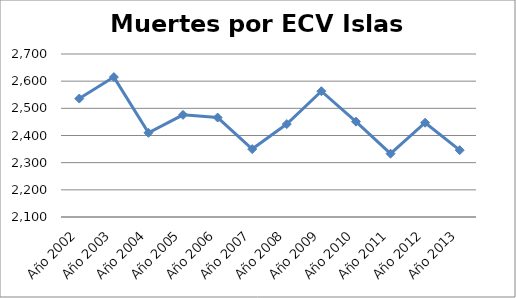
| Category | Series 0 |
|---|---|
| Año 2002 | 2536 |
| Año 2003 | 2615 |
| Año 2004 | 2410 |
| Año 2005 | 2476 |
| Año 2006 | 2466 |
| Año 2007 | 2350 |
| Año 2008 | 2442 |
| Año 2009 | 2563 |
| Año 2010 | 2451 |
| Año 2011 | 2333 |
| Año 2012 | 2447 |
| Año 2013 | 2346 |